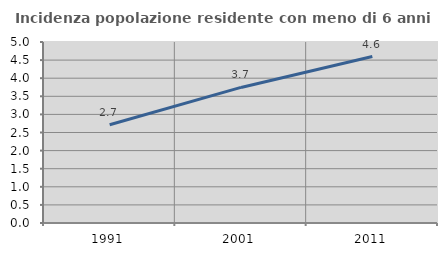
| Category | Incidenza popolazione residente con meno di 6 anni |
|---|---|
| 1991.0 | 2.713 |
| 2001.0 | 3.745 |
| 2011.0 | 4.598 |